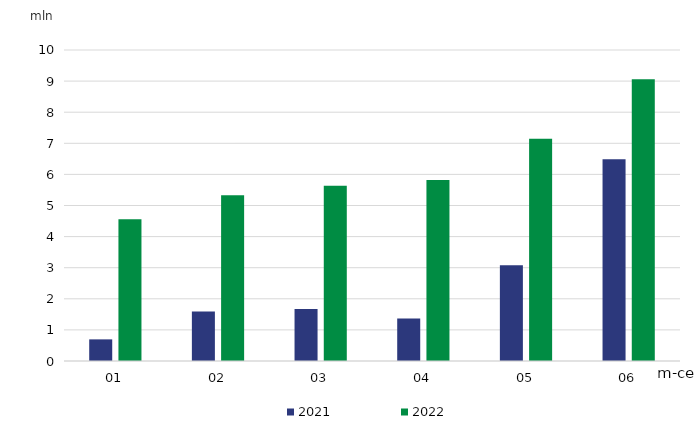
| Category | 2021 | 2022 |
|---|---|---|
| 01 | 0.696 | 4.556 |
| 02 | 1.588 | 5.328 |
| 03 | 1.67 | 5.636 |
| 04 | 1.368 | 5.819 |
| 05 | 3.078 | 7.148 |
| 06 | 6.489 | 9.062 |